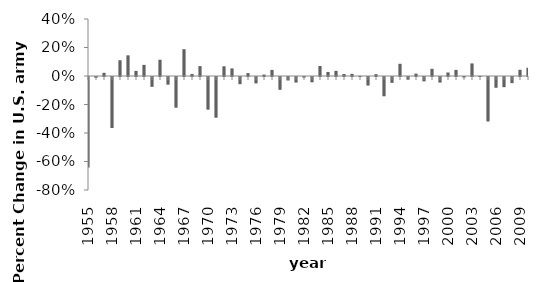
| Category | Series 0 |
|---|---|
| 1955.0 | -0.635 |
| 1956.0 | -0.006 |
| 1957.0 | 0.022 |
| 1958.0 | -0.358 |
| 1959.0 | 0.111 |
| 1960.0 | 0.145 |
| 1961.0 | 0.036 |
| 1962.0 | 0.078 |
| 1963.0 | -0.069 |
| 1964.0 | 0.114 |
| 1965.0 | -0.054 |
| 1966.0 | -0.216 |
| 1967.0 | 0.188 |
| 1968.0 | 0.015 |
| 1969.0 | 0.07 |
| 1970.0 | -0.229 |
| 1971.0 | -0.286 |
| 1972.0 | 0.068 |
| 1973.0 | 0.053 |
| 1974.0 | -0.05 |
| 1975.0 | 0.02 |
| 1976.0 | -0.045 |
| 1977.0 | 0.01 |
| 1978.0 | 0.043 |
| 1979.0 | -0.09 |
| 1980.0 | -0.024 |
| 1981.0 | -0.039 |
| 1982.0 | -0.004 |
| 1983.0 | -0.037 |
| 1984.0 | 0.07 |
| 1985.0 | 0.028 |
| 1986.0 | 0.036 |
| 1987.0 | 0.014 |
| 1988.0 | 0.015 |
| 1989.0 | 0.001 |
| 1990.0 | -0.06 |
| 1991.0 | 0.013 |
| 1992.0 | -0.135 |
| 1993.0 | -0.041 |
| 1994.0 | 0.086 |
| 1995.0 | -0.019 |
| 1996.0 | 0.017 |
| 1997.0 | -0.031 |
| 1998.0 | 0.05 |
| 1999.0 | -0.039 |
| 2000.0 | 0.025 |
| 2001.0 | 0.043 |
| 2002.0 | -0.004 |
| 2003.0 | 0.088 |
| 2004.0 | 0.001 |
| 2005.0 | -0.312 |
| 2006.0 | -0.076 |
| 2007.0 | -0.071 |
| 2008.0 | -0.043 |
| 2009.0 | 0.044 |
| 2010.0 | 0.058 |